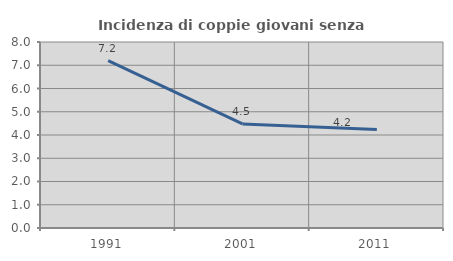
| Category | Incidenza di coppie giovani senza figli |
|---|---|
| 1991.0 | 7.2 |
| 2001.0 | 4.478 |
| 2011.0 | 4.233 |